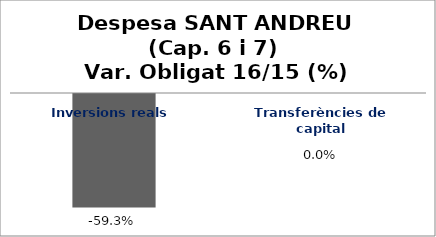
| Category | Series 0 |
|---|---|
| Inversions reals | -0.593 |
| Transferències de capital | 0 |